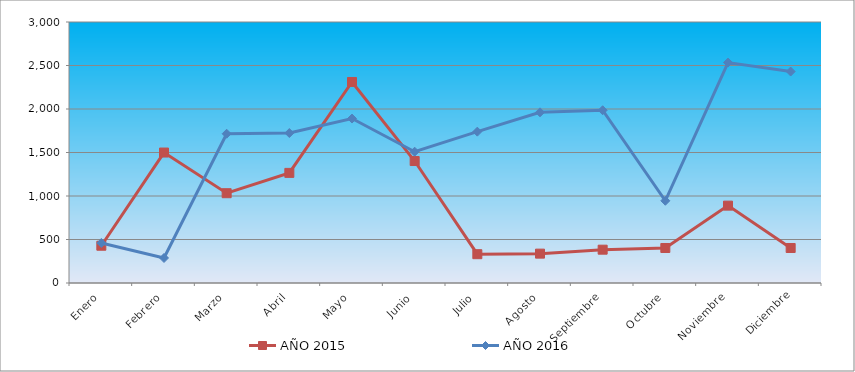
| Category | AÑO 2015 | AÑO 2016 |
|---|---|---|
| Enero | 428.42 | 459.807 |
| Febrero | 1499.469 | 287.38 |
| Marzo | 1032.102 | 1715.692 |
| Abril | 1265.786 | 1723.635 |
| Mayo | 2310.871 | 1890.438 |
| Junio | 1402.101 | 1509.173 |
| Julio | 331.052 | 1739.521 |
| Agosto | 337.543 | 1961.925 |
| Septiembre | 382.981 | 1985.754 |
| Octubre | 402.455 | 945.219 |
| Noviembre | 889.296 | 2533.822 |
| Diciembre | 402.455 | 2430.563 |